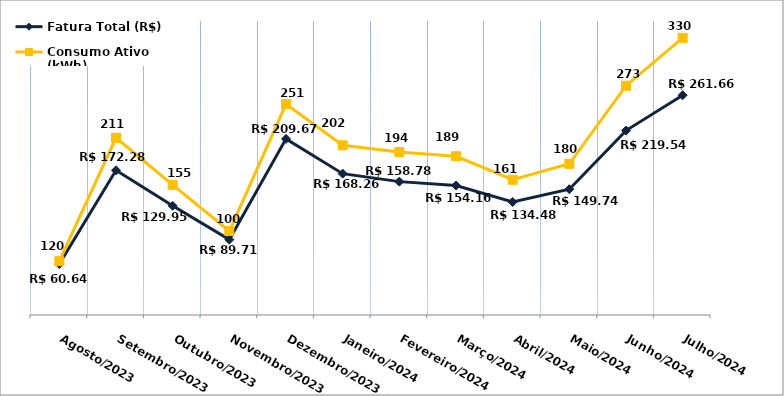
| Category | Fatura Total (R$) | Consumo Ativo (kWh) |
|---|---|---|
| Agosto/2023 | 60.64 | 64 |
| Setembro/2023 | 172.28 | 211 |
| Outubro/2023 | 129.95 | 155 |
| Novembro/2023 | 89.71 | 100 |
| Dezembro/2023 | 209.67 | 251 |
| Janeiro/2024 | 168.26 | 202 |
| Fevereiro/2024 | 158.78 | 194 |
| Março/2024 | 154.16 | 189 |
| Abril/2024 | 134.48 | 161 |
| Maio/2024 | 149.74 | 180 |
| Junho/2024 | 219.54 | 273 |
| Julho/2024 | 261.66 | 330 |